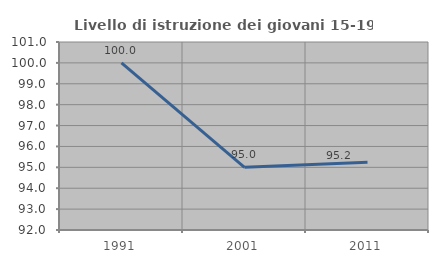
| Category | Livello di istruzione dei giovani 15-19 anni |
|---|---|
| 1991.0 | 100 |
| 2001.0 | 95 |
| 2011.0 | 95.238 |